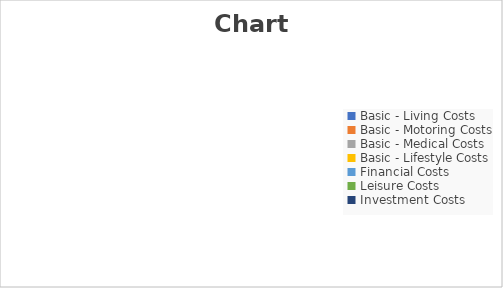
| Category | Series 0 |
|---|---|
| Basic - Living Costs | 0 |
| Basic - Motoring Costs | 0 |
| Basic - Medical Costs | 0 |
| Basic - Lifestyle Costs | 0 |
| Financial Costs | 0 |
| Leisure Costs | 0 |
| Investment Costs | 0 |